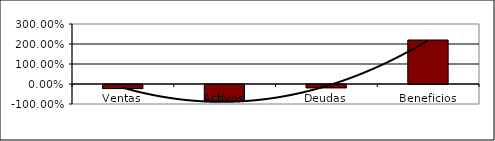
| Category | Series 0 |
|---|---|
| Ventas | -0.205 |
| Activos | -0.831 |
| Deudas | -0.165 |
| Beneficios | 2.2 |